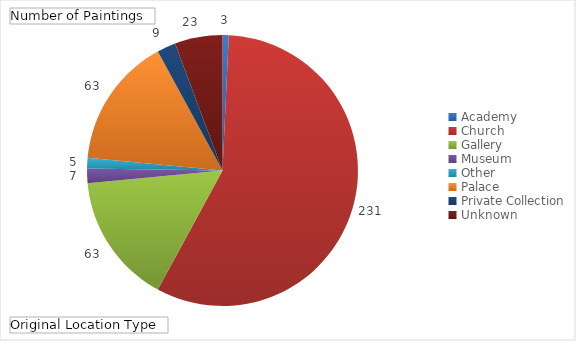
| Category | Total |
|---|---|
| Academy | 3 |
| Church | 231 |
| Gallery | 63 |
| Museum | 7 |
| Other | 5 |
| Palace | 63 |
| Private Collection | 9 |
| Unknown | 23 |